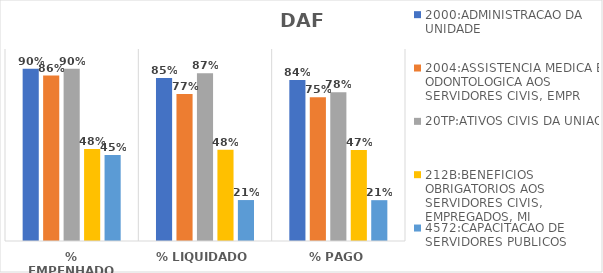
| Category | 2000:ADMINISTRACAO DA UNIDADE | 2004:ASSISTENCIA MEDICA E ODONTOLOGICA AOS SERVIDORES CIVIS, EMPR | 20TP:ATIVOS CIVIS DA UNIAO | 212B:BENEFICIOS OBRIGATORIOS AOS SERVIDORES CIVIS, EMPREGADOS, MI | 4572:CAPACITACAO DE SERVIDORES PUBLICOS FEDERAIS EM PROCESSO DE Q |
|---|---|---|---|---|---|
| % EMPENHADO | 0.897 | 0.862 | 0.898 | 0.48 | 0.448 |
| % LIQUIDADO | 0.849 | 0.766 | 0.873 | 0.475 | 0.213 |
| % PAGO | 0.838 | 0.749 | 0.775 | 0.475 | 0.213 |